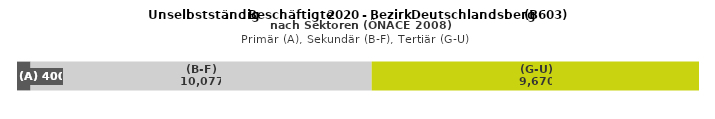
| Category | (A) | (B-F) | (G-U) |
|---|---|---|---|
| 0 | 400 | 10077 | 9670 |